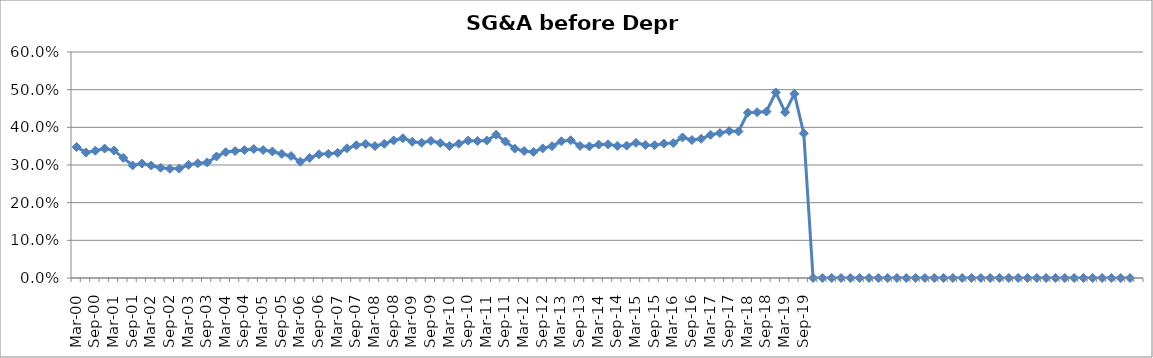
| Category | SG&A (before depr.) % |
|---|---|
| Mar-00 | 0.348 |
| Jun-00 | 0.333 |
| Sep-00 | 0.338 |
| Dec-00 | 0.344 |
| Mar-01 | 0.338 |
| Jun-01 | 0.319 |
| Sep-01 | 0.299 |
| Dec-01 | 0.304 |
| Mar-02 | 0.299 |
| Jun-02 | 0.293 |
| Sep-02 | 0.29 |
| Dec-02 | 0.29 |
| Mar-03 | 0.3 |
| Jun-03 | 0.305 |
| Sep-03 | 0.307 |
| Dec-03 | 0.323 |
| Mar-04 | 0.334 |
| Jun-04 | 0.337 |
| Sep-04 | 0.34 |
| Dec-04 | 0.342 |
| Mar-05 | 0.34 |
| Jun-05 | 0.336 |
| Sep-05 | 0.329 |
| Dec-05 | 0.324 |
| Mar-06 | 0.309 |
| Jun-06 | 0.319 |
| Sep-06 | 0.328 |
| Dec-06 | 0.33 |
| Mar-07 | 0.332 |
| Jun-07 | 0.344 |
| Sep-07 | 0.352 |
| Dec-07 | 0.356 |
| Mar-08 | 0.35 |
| Jun-08 | 0.356 |
| Sep-08 | 0.365 |
| Dec-08 | 0.371 |
| Mar-09 | 0.362 |
| Jun-09 | 0.359 |
| Sep-09 | 0.364 |
| Dec-09 | 0.358 |
| Mar-10 | 0.35 |
| Jun-10 | 0.356 |
| Sep-10 | 0.365 |
| Dec-10 | 0.364 |
| Mar-11 | 0.365 |
| Jun-11 | 0.38 |
| Sep-11 | 0.362 |
| Dec-11 | 0.343 |
| Mar-12 | 0.337 |
| Jun-12 | 0.335 |
| Sep-12 | 0.344 |
| Dec-12 | 0.35 |
| Mar-13 | 0.363 |
| Jun-13 | 0.366 |
| Sep-13 | 0.351 |
| Dec-13 | 0.349 |
| Mar-14 | 0.354 |
| Jun-14 | 0.355 |
| Sep-14 | 0.351 |
| Dec-14 | 0.351 |
| Mar-15 | 0.359 |
| Jun-15 | 0.353 |
| Sep-15 | 0.353 |
| Dec-15 | 0.357 |
| Mar-16 | 0.358 |
| Jun-16 | 0.373 |
| Sep-16 | 0.366 |
| Dec-16 | 0.37 |
| Mar-17 | 0.38 |
| Jun-17 | 0.385 |
| Sep-17 | 0.39 |
| Dec-17 | 0.389 |
| Mar-18 | 0.439 |
| Jun-18 | 0.44 |
| Sep-18 | 0.442 |
| Dec-18 | 0.493 |
| Mar-19 | 0.44 |
| Jun-19 | 0.489 |
| Sep-19 | 0.384 |